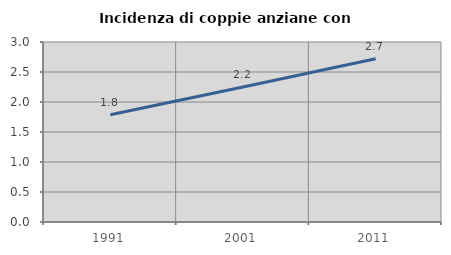
| Category | Incidenza di coppie anziane con figli |
|---|---|
| 1991.0 | 1.786 |
| 2001.0 | 2.25 |
| 2011.0 | 2.722 |